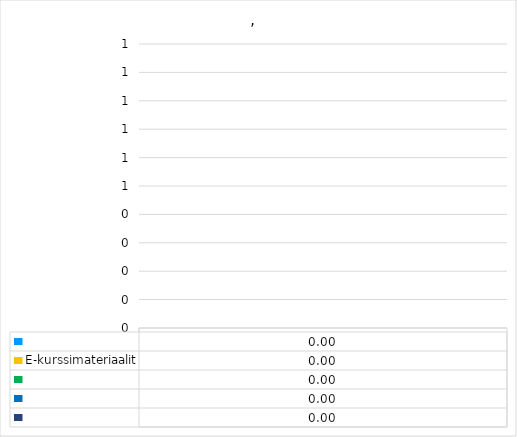
| Category | Series 3 | E-kurssimateriaalit | Series 5 | Series 6 | Series 10 |
|---|---|---|---|---|---|
| 0 | 0 | 0 | 0 | 0 | 0 |